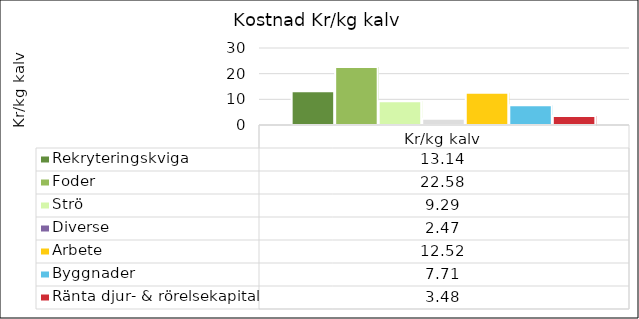
| Category | Rekryteringskviga | Foder | Strö | Diverse | Arbete | Byggnader | Ränta djur- & rörelsekapital |
|---|---|---|---|---|---|---|---|
| Kr/kg kalv | 13.144 | 22.581 | 9.287 | 2.47 | 12.522 | 7.71 | 3.483 |